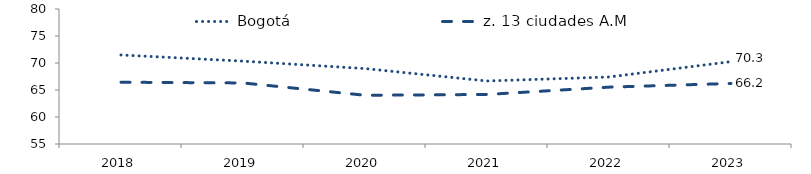
| Category | Bogotá | z. 13 ciudades A.M |
|---|---|---|
| 2018.0 | 71.486 | 66.44 |
| 2019.0 | 70.347 | 66.306 |
| 2020.0 | 68.968 | 64.024 |
| 2021.0 | 66.668 | 64.175 |
| 2022.0 | 67.408 | 65.53 |
| 2023.0 | 70.254 | 66.213 |